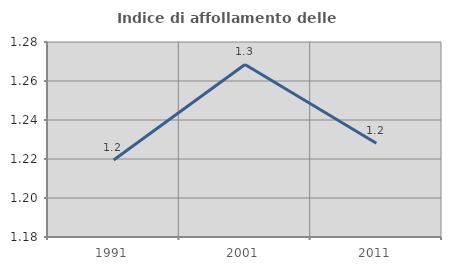
| Category | Indice di affollamento delle abitazioni  |
|---|---|
| 1991.0 | 1.22 |
| 2001.0 | 1.268 |
| 2011.0 | 1.228 |